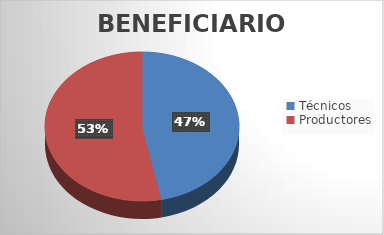
| Category | Series 0 |
|---|---|
| Técnicos  | 109 |
| Productores  | 124 |